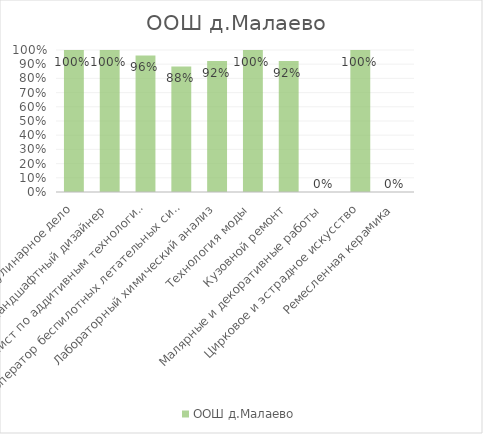
| Category | ООШ д.Малаево |
|---|---|
| Кулинарное дело | 1 |
| Ландшафтный дизайнер | 1 |
| Специалист по аддитивным технологиям | 0.962 |
| Оператор беспилотных летательных систем | 0.885 |
| Лабораторный химический анализ | 0.923 |
| Технология моды | 1 |
| Кузовной ремонт | 0.923 |
| Малярные и декоративные работы | 0 |
| Цирковое и эстрадное искусство | 1 |
| Ремесленная керамика | 0 |